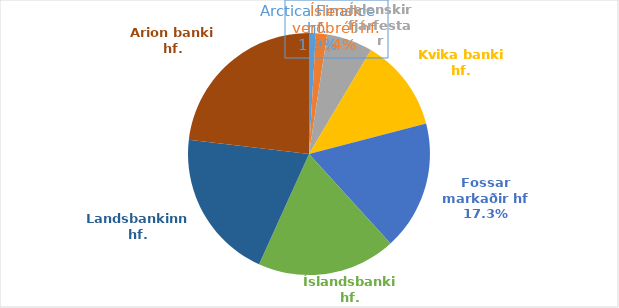
| Category | Total % |
|---|---|
| Arctica Finance hf. | 0.009 |
| Íslensk verðbréf hf. | 0.015 |
| Íslenskir fjárfestar | 0.062 |
| Kvika banki hf. | 0.124 |
| Fossar markaðir hf | 0.173 |
| Íslandsbanki hf. | 0.185 |
| Landsbankinn hf. | 0.201 |
| Arion banki hf. | 0.231 |